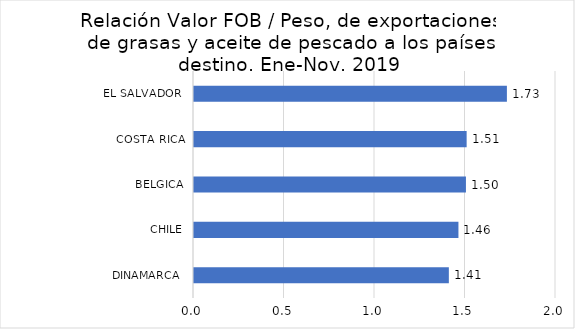
| Category | Series 0 |
|---|---|
| DINAMARCA  | 1.408 |
| CHILE | 1.461 |
| BELGICA | 1.502 |
| COSTA RICA | 1.506 |
| EL SALVADOR  | 1.729 |